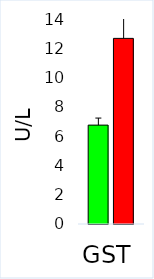
| Category | Control | ASD |
|---|---|---|
| GST | 6.753 | 12.677 |